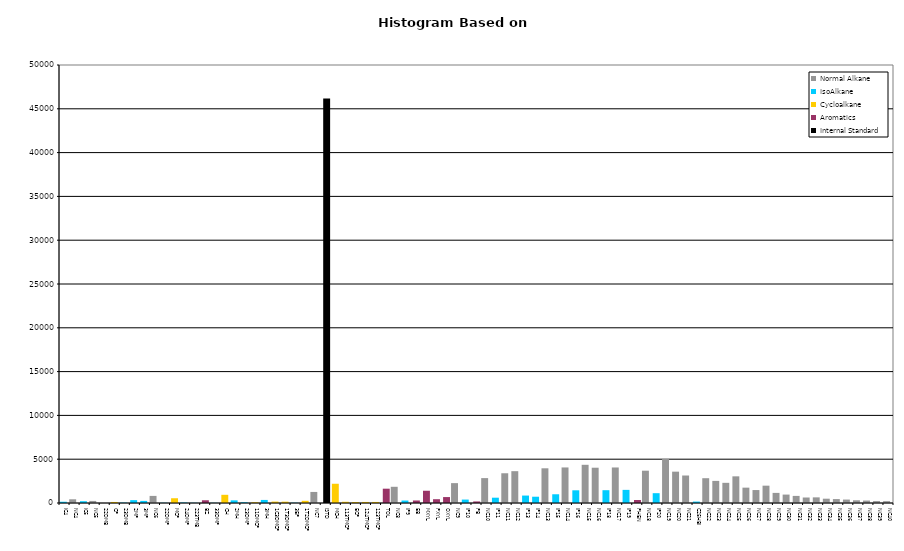
| Category | Normal Alkane | IsoAlkane | Cycloalkane | Aromatics | Internal Standard |
|---|---|---|---|---|---|
| IC4 | 0 | 143 | 0 | 0 | 0 |
| NC4 | 423 | 0 | 0 | 0 | 0 |
| IC5 | 0 | 204 | 0 | 0 | 0 |
| NC5 | 237 | 0 | 0 | 0 | 0 |
| 22DMB | 0 | 0 | 0 | 0 | 0 |
| CP | 0 | 0 | 118 | 0 | 0 |
| 23DMB | 0 | 43 | 0 | 0 | 0 |
| 2MP | 0 | 327 | 0 | 0 | 0 |
| 3MP | 0 | 239 | 0 | 0 | 0 |
| NC6 | 810 | 0 | 0 | 0 | 0 |
| 22DMP | 0 | 26 | 0 | 0 | 0 |
| MCP | 0 | 0 | 543 | 0 | 0 |
| 24DMP | 0 | 56 | 0 | 0 | 0 |
| 223TMB | 0 | 25 | 0 | 0 | 0 |
| BZ | 0 | 0 | 0 | 313 | 0 |
| 33DMP | 0 | 21 | 0 | 0 | 0 |
| CH | 0 | 0 | 935 | 0 | 0 |
| 2MH | 0 | 303 | 0 | 0 | 0 |
| 23DMP | 0 | 85 | 0 | 0 | 0 |
| 11DMCP | 0 | 0 | 85 | 0 | 0 |
| 3MH | 0 | 350 | 0 | 0 | 0 |
| 1C3DMCP | 0 | 0 | 161 | 0 | 0 |
| 1T3DMCP | 0 | 0 | 152 | 0 | 0 |
| 3EP | 0 | 30 | 0 | 0 | 0 |
| 1T2DMCP | 0 | 0 | 249 | 0 | 0 |
| NC7 | 1262 | 0 | 0 | 0 | 0 |
| ISTD | 0 | 0 | 0 | 0 | 46190 |
| MCH | 0 | 0 | 2197 | 0 | 0 |
| 113TMCP | 0 | 0 | 140 | 0 | 0 |
| ECP | 0 | 0 | 108 | 0 | 0 |
| 124TMCP | 0 | 0 | 120 | 0 | 0 |
| 123TMCP | 0 | 0 | 120 | 0 | 0 |
| TOL | 0 | 0 | 0 | 1634 | 0 |
| NC8 | 1850 | 0 | 0 | 0 | 0 |
| IP9 | 0 | 282 | 0 | 0 | 0 |
| EB | 0 | 0 | 0 | 288 | 0 |
| MXYL | 0 | 0 | 0 | 1399 | 0 |
| PXYL | 0 | 0 | 0 | 434 | 0 |
| OXYL | 0 | 0 | 0 | 677 | 0 |
| NC9 | 2269 | 0 | 0 | 0 | 0 |
| IP10 | 0 | 391 | 0 | 0 | 0 |
| PB | 0 | 0 | 0 | 179 | 0 |
| NC10 | 2842 | 0 | 0 | 0 | 0 |
| IP11 | 0 | 606 | 0 | 0 | 0 |
| NC11 | 3395 | 0 | 0 | 0 | 0 |
| NC12 | 3634 | 0 | 0 | 0 | 0 |
| IP13 | 0 | 849 | 0 | 0 | 0 |
| IP14 | 0 | 717 | 0 | 0 | 0 |
| NC13 | 3962 | 0 | 0 | 0 | 0 |
| IP15 | 0 | 997 | 0 | 0 | 0 |
| NC14 | 4059 | 0 | 0 | 0 | 0 |
| IP16 | 0 | 1450 | 0 | 0 | 0 |
| NC15 | 4361 | 0 | 0 | 0 | 0 |
| NC16 | 4028 | 0 | 0 | 0 | 0 |
| IP18 | 0 | 1462 | 0 | 0 | 0 |
| NC17 | 4055 | 0 | 0 | 0 | 0 |
| IP19 | 0 | 1498 | 0 | 0 | 0 |
| PHEN | 0 | 0 | 0 | 343 | 0 |
| NC18 | 3688 | 0 | 0 | 0 | 0 |
| IP20 | 0 | 1121 | 0 | 0 | 0 |
| NC19 | 5028 | 0 | 0 | 0 | 0 |
| NC20 | 3578 | 0 | 0 | 0 | 0 |
| NC21 | 3139 | 0 | 0 | 0 | 0 |
| C25HBI | 0 | 164 | 0 | 0 | 0 |
| NC22 | 2831 | 0 | 0 | 0 | 0 |
| NC23 | 2523 | 0 | 0 | 0 | 0 |
| NC24 | 2302 | 0 | 0 | 0 | 0 |
| NC25 | 3044 | 0 | 0 | 0 | 0 |
| NC26 | 1753 | 0 | 0 | 0 | 0 |
| NC27 | 1479 | 0 | 0 | 0 | 0 |
| NC28 | 1978 | 0 | 0 | 0 | 0 |
| NC29 | 1153 | 0 | 0 | 0 | 0 |
| NC30 | 961 | 0 | 0 | 0 | 0 |
| NC31 | 810 | 0 | 0 | 0 | 0 |
| NC32 | 627 | 0 | 0 | 0 | 0 |
| NC33 | 644 | 0 | 0 | 0 | 0 |
| NC34 | 491 | 0 | 0 | 0 | 0 |
| NC35 | 448 | 0 | 0 | 0 | 0 |
| NC36 | 392 | 0 | 0 | 0 | 0 |
| NC37 | 310 | 0 | 0 | 0 | 0 |
| NC38 | 279 | 0 | 0 | 0 | 0 |
| NC39 | 223 | 0 | 0 | 0 | 0 |
| NC40 | 214 | 0 | 0 | 0 | 0 |